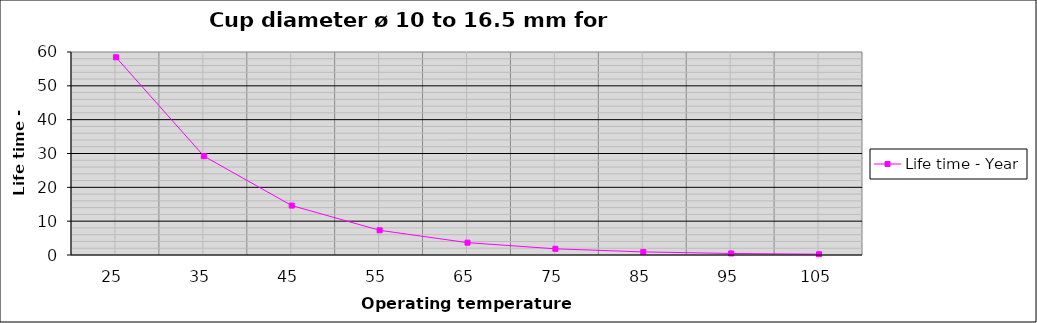
| Category | Life time - Year |
|---|---|
| 25.0 | 58.447 |
| 35.0 | 29.224 |
| 45.0 | 14.612 |
| 55.0 | 7.306 |
| 65.0 | 3.653 |
| 75.0 | 1.826 |
| 85.0 | 0.913 |
| 95.0 | 0.457 |
| 105.0 | 0.228 |